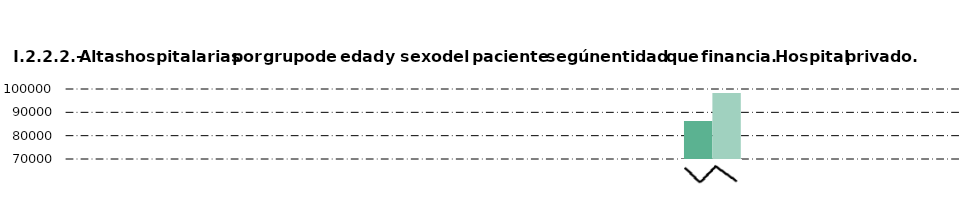
| Category |     Hombre |     Mujer |
|---|---|---|
| Andalucía | 1 | 7 |
| Castilla y León  | 3 | 5 |
| Castilla - La Mancha | 330 | 294 |
| Extremadura | 7 | 1 |
| Madrid (Comunidad de) | 4770 | 4201 |
| Resto de CC.AA. | 1098 | 1226 |
| Mutualidades y aseguradoras | 86288 | 98239 |
| Particulares | 5497 | 11465 |
| Otros | 1591 | 3924 |